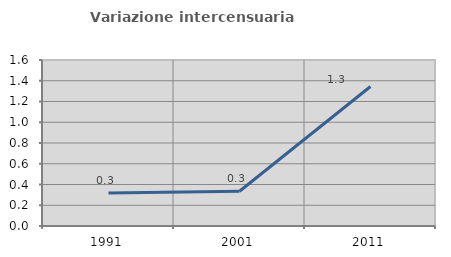
| Category | Variazione intercensuaria annua |
|---|---|
| 1991.0 | 0.317 |
| 2001.0 | 0.335 |
| 2011.0 | 1.345 |